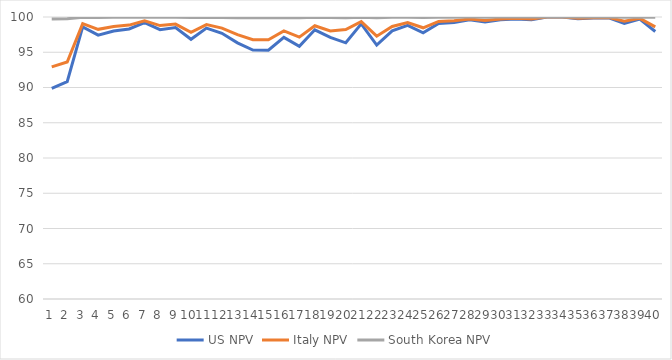
| Category | US NPV | Italy NPV | South Korea NPV |
|---|---|---|---|
| 0 | 89.87 | 92.92 | 99.72 |
| 1 | 90.83 | 93.61 | 99.75 |
| 2 | 98.6 | 99.05 | 99.96 |
| 3 | 97.43 | 98.25 | 99.93 |
| 4 | 98.01 | 98.65 | 99.95 |
| 5 | 98.31 | 98.85 | 99.96 |
| 6 | 99.19 | 99.45 | 99.98 |
| 7 | 98.2 | 98.78 | 99.95 |
| 8 | 98.51 | 98.99 | 99.96 |
| 9 | 96.84 | 97.84 | 99.92 |
| 10 | 98.42 | 98.92 | 99.96 |
| 11 | 97.69 | 98.43 | 99.94 |
| 12 | 96.33 | 97.49 | 99.9 |
| 13 | 95.31 | 96.78 | 99.88 |
| 14 | 95.3 | 96.78 | 99.88 |
| 15 | 97.11 | 98.03 | 99.93 |
| 16 | 95.84 | 97.15 | 99.89 |
| 17 | 98.18 | 98.76 | 99.95 |
| 18 | 97.11 | 98.03 | 99.93 |
| 19 | 96.34 | 98.21 | 99.91 |
| 20 | 99.03 | 99.34 | 99.98 |
| 21 | 96.02 | 97.28 | 99.9 |
| 22 | 98.04 | 98.66 | 99.95 |
| 23 | 98.81 | 99.2 | 99.97 |
| 24 | 97.76 | 98.47 | 99.94 |
| 25 | 99.07 | 99.37 | 99.98 |
| 26 | 99.21 | 99.46 | 99.98 |
| 27 | 99.6 | 99.73 | 99.99 |
| 28 | 99.28 | 99.51 | 99.98 |
| 29 | 99.6 | 99.73 | 99.99 |
| 30 | 99.73 | 99.82 | 99.99 |
| 31 | 99.6 | 99.73 | 99.99 |
| 32 | 100 | 100 | 100 |
| 33 | 100 | 100 | 100 |
| 34 | 99.74 | 99.83 | 99.99 |
| 35 | 99.87 | 99.91 | 100 |
| 36 | 99.87 | 99.91 | 100 |
| 37 | 99.1 | 99.39 | 99.98 |
| 38 | 99.71 | 99.81 | 99.99 |
| 39 | 97.94 | 98.6 | 99.95 |